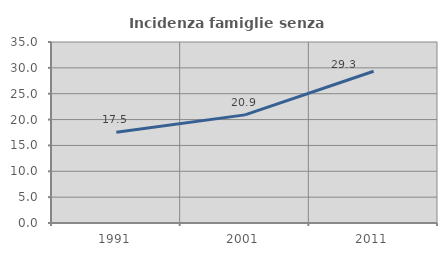
| Category | Incidenza famiglie senza nuclei |
|---|---|
| 1991.0 | 17.547 |
| 2001.0 | 20.908 |
| 2011.0 | 29.341 |